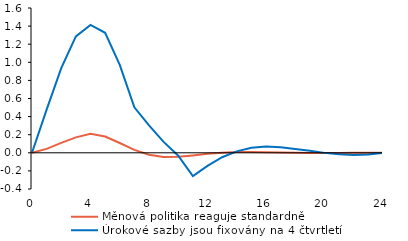
| Category | Měnová politika reaguje standardně | Úrokové sazby jsou fixovány na 4 čtvrtletí |
|---|---|---|
| 0.0 | 0 | 0 |
| 1.0 | 0.043 | 0.476 |
| 2.0 | 0.109 | 0.936 |
| 3.0 | 0.171 | 1.286 |
| 4.0 | 0.21 | 1.414 |
| 5.0 | 0.18 | 1.326 |
| 6.0 | 0.108 | 0.972 |
| 7.0 | 0.032 | 0.503 |
| 8.0 | -0.022 | 0.304 |
| 9.0 | -0.046 | 0.12 |
| 10.0 | -0.044 | -0.032 |
| 11.0 | -0.029 | -0.258 |
| 12.0 | -0.011 | -0.145 |
| 13.0 | 0.002 | -0.049 |
| 14.0 | 0.008 | 0.016 |
| 15.0 | 0.009 | 0.056 |
| 16.0 | 0.006 | 0.071 |
| 17.0 | 0.003 | 0.061 |
| 18.0 | 0.001 | 0.042 |
| 19.0 | -0.001 | 0.023 |
| 20.0 | -0.001 | -0.001 |
| 21.0 | -0.001 | -0.016 |
| 22.0 | -0.001 | -0.025 |
| 23.0 | 0 | -0.02 |
| 24.0 | 0 | -0.002 |